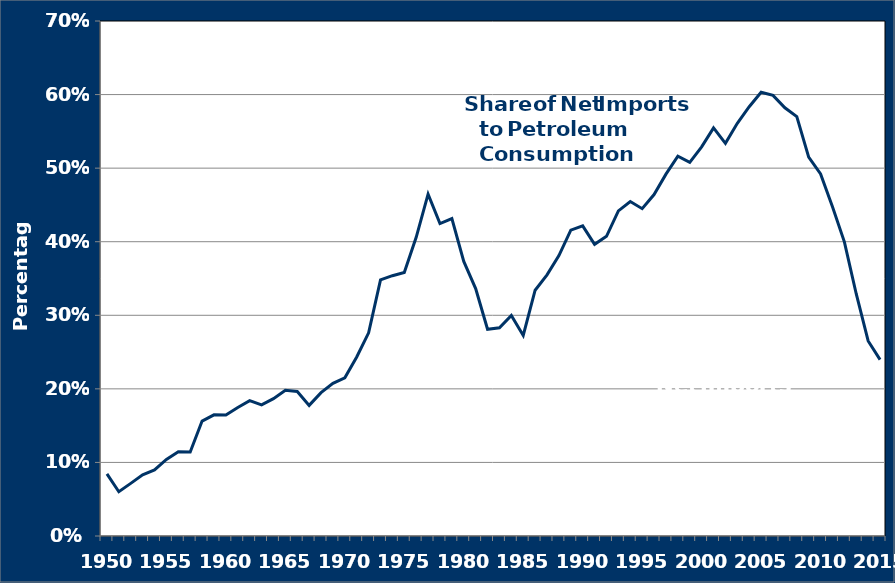
| Category | Share of Net Imports |
|---|---|
| 1950.0 | 0.084 |
| 1951.0 | 0.06 |
| 1952.0 | 0.072 |
| 1953.0 | 0.083 |
| 1954.0 | 0.09 |
| 1955.0 | 0.104 |
| 1956.0 | 0.115 |
| 1957.0 | 0.114 |
| 1958.0 | 0.156 |
| 1959.0 | 0.165 |
| 1960.0 | 0.165 |
| 1961.0 | 0.175 |
| 1962.0 | 0.184 |
| 1963.0 | 0.178 |
| 1964.0 | 0.187 |
| 1965.0 | 0.198 |
| 1966.0 | 0.197 |
| 1967.0 | 0.178 |
| 1968.0 | 0.195 |
| 1969.0 | 0.207 |
| 1970.0 | 0.215 |
| 1971.0 | 0.243 |
| 1972.0 | 0.276 |
| 1973.0 | 0.348 |
| 1974.0 | 0.354 |
| 1975.0 | 0.358 |
| 1976.0 | 0.406 |
| 1977.0 | 0.465 |
| 1978.0 | 0.425 |
| 1979.0 | 0.431 |
| 1980.0 | 0.373 |
| 1981.0 | 0.336 |
| 1982.0 | 0.281 |
| 1983.0 | 0.283 |
| 1984.0 | 0.3 |
| 1985.0 | 0.273 |
| 1986.0 | 0.334 |
| 1987.0 | 0.355 |
| 1988.0 | 0.381 |
| 1989.0 | 0.416 |
| 1990.0 | 0.422 |
| 1991.0 | 0.396 |
| 1992.0 | 0.407 |
| 1993.0 | 0.442 |
| 1994.0 | 0.455 |
| 1995.0 | 0.445 |
| 1996.0 | 0.464 |
| 1997.0 | 0.492 |
| 1998.0 | 0.516 |
| 1999.0 | 0.508 |
| 2000.0 | 0.529 |
| 2001.0 | 0.555 |
| 2002.0 | 0.534 |
| 2003.0 | 0.561 |
| 2004.0 | 0.584 |
| 2005.0 | 0.603 |
| 2006.0 | 0.599 |
| 2007.0 | 0.582 |
| 2008.0 | 0.57 |
| 2009.0 | 0.515 |
| 2010.0 | 0.492 |
| 2011.0 | 0.448 |
| 2012.0 | 0.4 |
| 2013.0 | 0.329 |
| 2014.0 | 0.265 |
| 2015.0 | 0.24 |